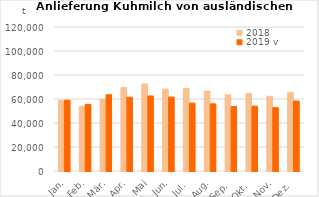
| Category | 2018 | 2019 v |
|---|---|---|
| Jan. | 58931.573 | 59045.324 |
| Feb. | 53830.549 | 55555.762 |
| Mär. | 59973.336 | 63532.15 |
| Apr. | 69468.248 | 61409.862 |
| Mai | 72509.213 | 62550.889 |
| Jun. | 68184.846 | 61577.981 |
| Jul. | 68863.053 | 56583.089 |
| Aug. | 66631.182 | 55962.779 |
| Sep. | 63390.54 | 53799.414 |
| Okt. | 64547.039 | 54047.619 |
| Nov. | 62230.689 | 52749.917 |
| Dez. | 65431.147 | 58308.463 |